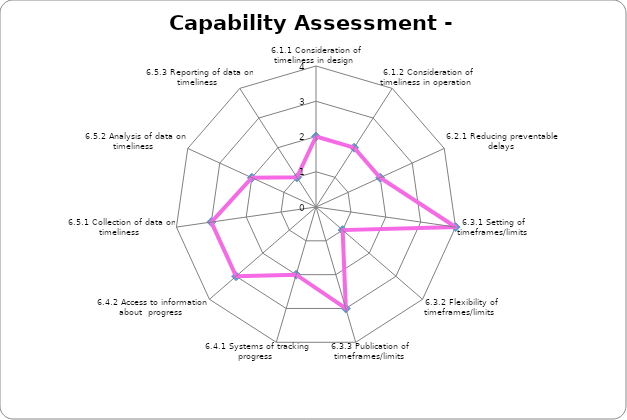
| Category | Series 0 |
|---|---|
| 6.1.1 Consideration of timeliness in design  | 2 |
| 6.1.2 Consideration of timeliness in operation  | 2 |
| 6.2.1 Reducing preventable delays  | 2 |
| 6.3.1 Setting of timeframes/limits | 4 |
| 6.3.2 Flexibility of timeframes/limits  | 1 |
| 6.3.3 Publication of timeframes/limits  | 3 |
| 6.4.1 Systems of tracking progress  | 2 |
| 6.4.2 Access to information about  progress  | 3 |
| 6.5.1 Collection of data on timeliness  | 3 |
| 6.5.2 Analysis of data on timeliness  | 2 |
| 6.5.3 Reporting of data on timeliness  | 1 |